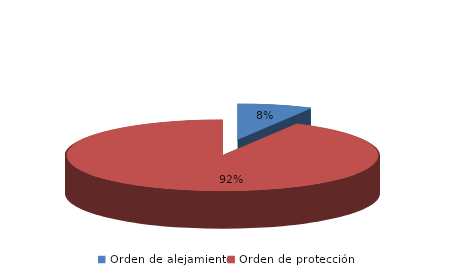
| Category | Series 0 |
|---|---|
| Orden de alejamiento | 30 |
| Orden de protección | 360 |